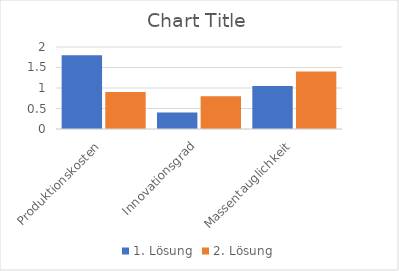
| Category | 1. Lösung | 2. Lösung |
|---|---|---|
| Produktionskosten | 1.8 | 0.9 |
| Innovationsgrad | 0.4 | 0.8 |
| Massentauglichkeit | 1.05 | 1.4 |